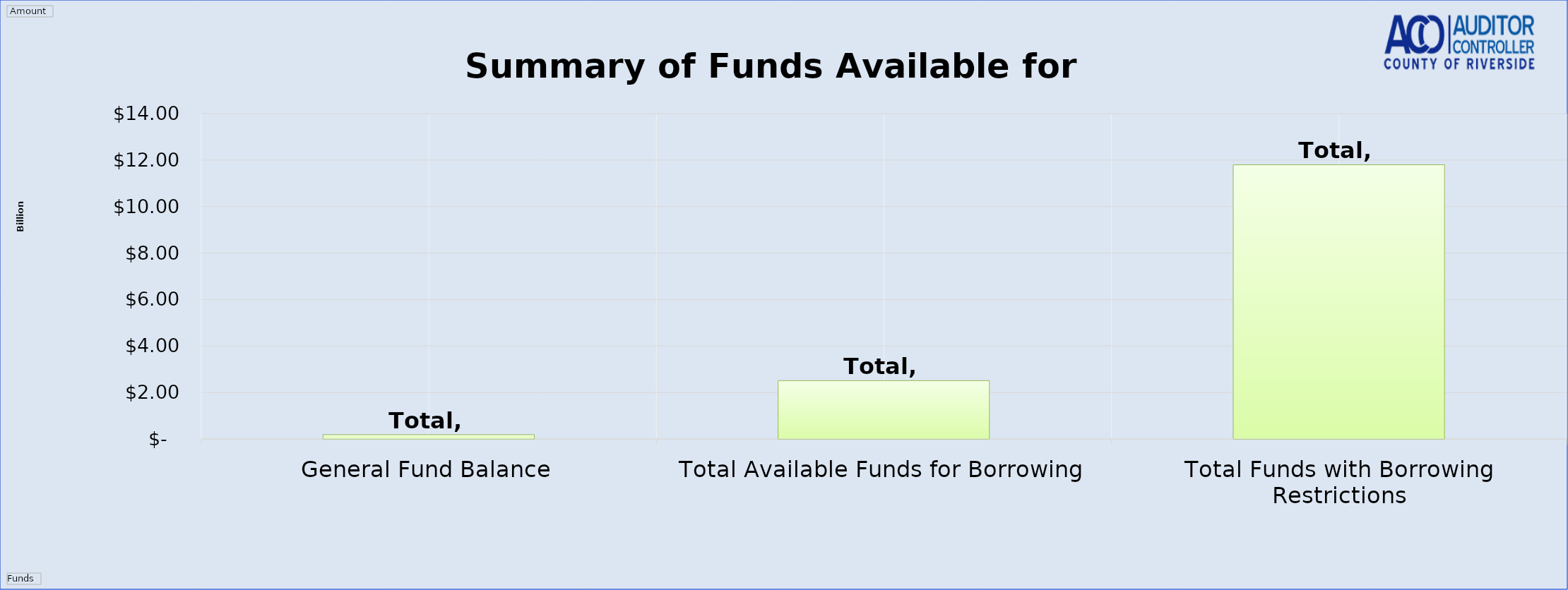
| Category | Total |
|---|---|
| General Fund Balance | 185669132.405 |
| Total Available Funds for Borrowing | 2510489567.425 |
| Total Funds with Borrowing Restrictions | 11799536555.14 |